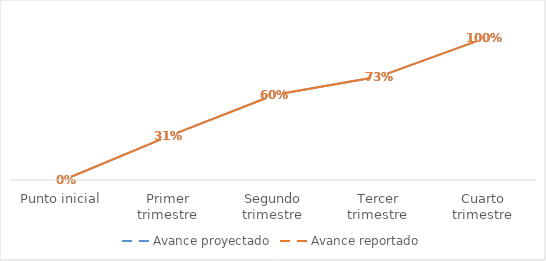
| Category | Avance proyectado | Avance reportado |
|---|---|---|
| Punto inicial | 0 | 0 |
| Primer trimestre | 0.31 | 0.31 |
| Segundo trimestre | 0.6 | 0.6 |
| Tercer trimestre | 0.73 | 0.73 |
| Cuarto trimestre | 1 | 1 |